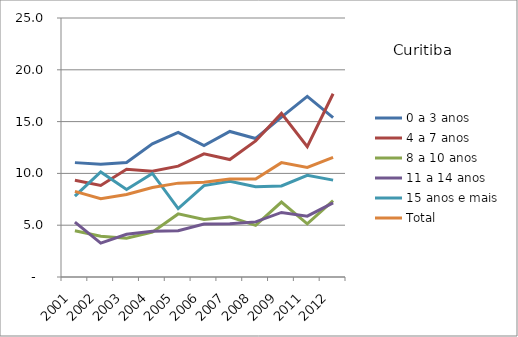
| Category | 0 a 3 anos | 4 a 7 anos | 8 a 10 anos | 11 a 14 anos | 15 anos e mais | Total |
|---|---|---|---|---|---|---|
| 2001.0 | 11.04 | 9.34 | 4.47 | 5.3 | 7.8 | 8.26 |
| 2002.0 | 10.89 | 8.83 | 3.94 | 3.27 | 10.14 | 7.56 |
| 2003.0 | 11.05 | 10.4 | 3.75 | 4.13 | 8.45 | 7.96 |
| 2004.0 | 12.86 | 10.21 | 4.33 | 4.42 | 10 | 8.64 |
| 2005.0 | 13.96 | 10.7 | 6.09 | 4.46 | 6.6 | 9.06 |
| 2006.0 | 12.68 | 11.89 | 5.56 | 5.11 | 8.82 | 9.15 |
| 2007.0 | 14.05 | 11.34 | 5.8 | 5.13 | 9.24 | 9.46 |
| 2008.0 | 13.37 | 13.13 | 4.98 | 5.32 | 8.72 | 9.45 |
| 2009.0 | 15.44 | 15.79 | 7.23 | 6.23 | 8.79 | 11.04 |
| 2011.0 | 17.44 | 12.58 | 5.13 | 5.87 | 9.82 | 10.58 |
| 2012.0 | 15.38 | 17.69 | 7.38 | 7.15 | 9.35 | 11.55 |